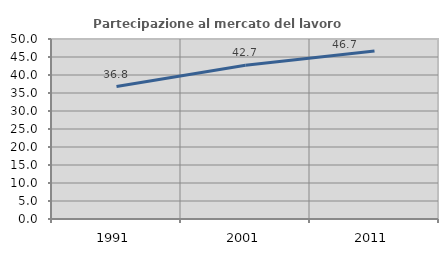
| Category | Partecipazione al mercato del lavoro  femminile |
|---|---|
| 1991.0 | 36.789 |
| 2001.0 | 42.718 |
| 2011.0 | 46.667 |